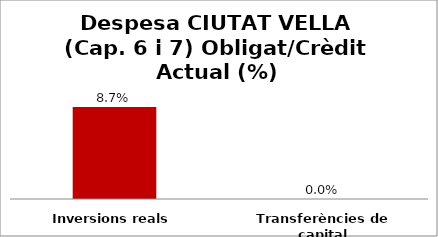
| Category | Series 0 |
|---|---|
| Inversions reals | 0.087 |
| Transferències de capital | 0 |